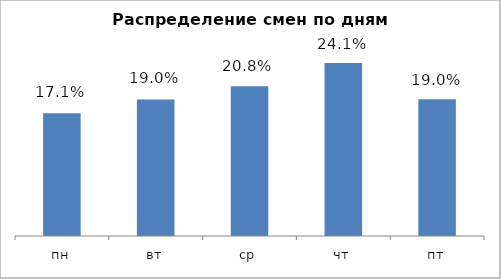
| Category | Итог |
|---|---|
| пн | 0.171 |
| вт | 0.19 |
| ср | 0.208 |
| чт | 0.241 |
| пт | 0.19 |